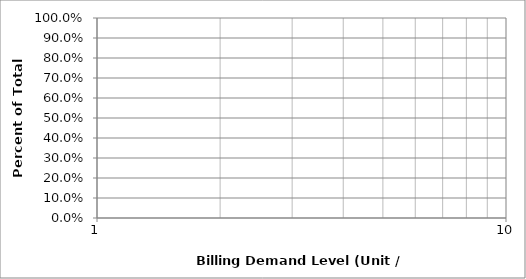
| Category | Series 7 |
|---|---|
| 0 | 0.062 |
| 1 | 0.123 |
| 2 | 0.182 |
| 3 | 0.239 |
| 4 | 0.294 |
| 5 | 0.345 |
| 6 | 0.394 |
| 7 | 0.439 |
| 8 | 0.481 |
| 9 | 0.519 |
| 10 | 0.554 |
| 11 | 0.585 |
| 12 | 0.614 |
| 13 | 0.64 |
| 14 | 0.663 |
| 15 | 0.684 |
| 16 | 0.703 |
| 17 | 0.72 |
| 18 | 0.736 |
| 19 | 0.75 |
| 20 | 0.763 |
| 21 | 0.774 |
| 22 | 0.785 |
| 23 | 0.794 |
| 24 | 0.803 |
| 25 | 0.811 |
| 26 | 0.819 |
| 27 | 0.825 |
| 28 | 0.832 |
| 29 | 0.838 |
| 30 | 0.843 |
| 31 | 0.848 |
| 32 | 0.853 |
| 33 | 0.858 |
| 34 | 0.862 |
| 35 | 0.866 |
| 36 | 0.87 |
| 37 | 0.873 |
| 38 | 0.877 |
| 39 | 0.88 |
| 40 | 0.883 |
| 41 | 0.886 |
| 42 | 0.889 |
| 43 | 0.891 |
| 44 | 0.894 |
| 45 | 0.896 |
| 46 | 0.899 |
| 47 | 0.901 |
| 48 | 0.903 |
| 49 | 0.905 |
| 50 | 0.907 |
| 51 | 0.909 |
| 52 | 0.911 |
| 53 | 0.913 |
| 54 | 0.914 |
| 55 | 0.916 |
| 56 | 0.918 |
| 57 | 0.919 |
| 58 | 0.921 |
| 59 | 0.922 |
| 60 | 0.923 |
| 61 | 0.925 |
| 62 | 0.926 |
| 63 | 0.927 |
| 64 | 0.928 |
| 65 | 0.93 |
| 66 | 0.931 |
| 67 | 0.932 |
| 68 | 0.933 |
| 69 | 0.934 |
| 70 | 0.935 |
| 71 | 0.936 |
| 72 | 0.937 |
| 73 | 0.938 |
| 74 | 0.939 |
| 75 | 0.94 |
| 76 | 0.94 |
| 77 | 0.941 |
| 78 | 0.942 |
| 79 | 0.943 |
| 80 | 0.944 |
| 81 | 0.944 |
| 82 | 0.945 |
| 83 | 0.946 |
| 84 | 0.946 |
| 85 | 0.947 |
| 86 | 0.948 |
| 87 | 0.948 |
| 88 | 0.949 |
| 89 | 0.95 |
| 90 | 0.95 |
| 91 | 0.951 |
| 92 | 0.951 |
| 93 | 0.952 |
| 94 | 0.952 |
| 95 | 0.953 |
| 96 | 0.953 |
| 97 | 0.954 |
| 98 | 0.954 |
| 99 | 0.955 |
| 100 | 0.955 |
| 101 | 0.956 |
| 102 | 0.956 |
| 103 | 0.957 |
| 104 | 0.957 |
| 105 | 0.957 |
| 106 | 0.958 |
| 107 | 0.958 |
| 108 | 0.959 |
| 109 | 0.959 |
| 110 | 0.959 |
| 111 | 0.96 |
| 112 | 0.96 |
| 113 | 0.96 |
| 114 | 0.961 |
| 115 | 0.961 |
| 116 | 0.961 |
| 117 | 0.962 |
| 118 | 0.962 |
| 119 | 0.962 |
| 120 | 0.963 |
| 121 | 0.963 |
| 122 | 0.963 |
| 123 | 0.964 |
| 124 | 0.964 |
| 125 | 0.964 |
| 126 | 0.964 |
| 127 | 0.965 |
| 128 | 0.965 |
| 129 | 0.965 |
| 130 | 0.965 |
| 131 | 0.966 |
| 132 | 0.966 |
| 133 | 0.966 |
| 134 | 0.966 |
| 135 | 0.966 |
| 136 | 0.967 |
| 137 | 0.967 |
| 138 | 0.967 |
| 139 | 0.967 |
| 140 | 0.967 |
| 141 | 0.968 |
| 142 | 0.968 |
| 143 | 0.968 |
| 144 | 0.968 |
| 145 | 0.968 |
| 146 | 0.969 |
| 147 | 0.969 |
| 148 | 0.969 |
| 149 | 0.969 |
| 150 | 0.969 |
| 151 | 0.969 |
| 152 | 0.97 |
| 153 | 0.97 |
| 154 | 0.97 |
| 155 | 0.97 |
| 156 | 0.97 |
| 157 | 0.97 |
| 158 | 0.971 |
| 159 | 0.971 |
| 160 | 0.971 |
| 161 | 0.971 |
| 162 | 0.971 |
| 163 | 0.971 |
| 164 | 0.971 |
| 165 | 0.971 |
| 166 | 0.972 |
| 167 | 0.972 |
| 168 | 0.972 |
| 169 | 0.972 |
| 170 | 0.972 |
| 171 | 0.972 |
| 172 | 0.972 |
| 173 | 0.972 |
| 174 | 0.973 |
| 175 | 0.973 |
| 176 | 0.973 |
| 177 | 0.973 |
| 178 | 0.973 |
| 179 | 0.973 |
| 180 | 0.973 |
| 181 | 0.973 |
| 182 | 0.973 |
| 183 | 0.973 |
| 184 | 0.974 |
| 185 | 0.974 |
| 186 | 0.974 |
| 187 | 0.974 |
| 188 | 0.974 |
| 189 | 0.974 |
| 190 | 0.974 |
| 191 | 0.974 |
| 192 | 0.974 |
| 193 | 0.974 |
| 194 | 0.974 |
| 195 | 0.975 |
| 196 | 0.975 |
| 197 | 0.975 |
| 198 | 0.975 |
| 199 | 0.975 |
| 200 | 0.975 |
| 201 | 0.975 |
| 202 | 0.975 |
| 203 | 0.975 |
| 204 | 0.975 |
| 205 | 0.975 |
| 206 | 0.975 |
| 207 | 0.976 |
| 208 | 0.976 |
| 209 | 0.976 |
| 210 | 0.976 |
| 211 | 0.976 |
| 212 | 0.976 |
| 213 | 0.976 |
| 214 | 0.976 |
| 215 | 0.976 |
| 216 | 0.976 |
| 217 | 0.976 |
| 218 | 0.976 |
| 219 | 0.976 |
| 220 | 0.976 |
| 221 | 0.976 |
| 222 | 0.977 |
| 223 | 0.977 |
| 224 | 0.977 |
| 225 | 0.977 |
| 226 | 0.977 |
| 227 | 0.977 |
| 228 | 0.977 |
| 229 | 0.977 |
| 230 | 0.977 |
| 231 | 0.977 |
| 232 | 0.977 |
| 233 | 0.977 |
| 234 | 0.977 |
| 235 | 0.977 |
| 236 | 0.977 |
| 237 | 0.977 |
| 238 | 0.977 |
| 239 | 0.978 |
| 240 | 0.978 |
| 241 | 0.978 |
| 242 | 0.978 |
| 243 | 0.978 |
| 244 | 0.978 |
| 245 | 0.978 |
| 246 | 0.978 |
| 247 | 0.978 |
| 248 | 0.978 |
| 249 | 0.978 |
| 250 | 0.978 |
| 251 | 0.978 |
| 252 | 0.978 |
| 253 | 0.978 |
| 254 | 0.978 |
| 255 | 0.978 |
| 256 | 0.978 |
| 257 | 0.978 |
| 258 | 0.978 |
| 259 | 0.979 |
| 260 | 0.979 |
| 261 | 0.979 |
| 262 | 0.979 |
| 263 | 0.979 |
| 264 | 0.979 |
| 265 | 0.979 |
| 266 | 0.979 |
| 267 | 0.979 |
| 268 | 0.979 |
| 269 | 0.979 |
| 270 | 0.979 |
| 271 | 0.979 |
| 272 | 0.979 |
| 273 | 0.979 |
| 274 | 0.979 |
| 275 | 0.979 |
| 276 | 0.979 |
| 277 | 0.979 |
| 278 | 0.979 |
| 279 | 0.979 |
| 280 | 0.979 |
| 281 | 0.979 |
| 282 | 0.979 |
| 283 | 0.98 |
| 284 | 0.98 |
| 285 | 0.98 |
| 286 | 0.98 |
| 287 | 0.98 |
| 288 | 0.98 |
| 289 | 0.98 |
| 290 | 0.98 |
| 291 | 0.98 |
| 292 | 0.98 |
| 293 | 0.98 |
| 294 | 0.98 |
| 295 | 0.98 |
| 296 | 0.98 |
| 297 | 0.98 |
| 298 | 0.98 |
| 299 | 0.98 |
| 300 | 0.98 |
| 301 | 0.98 |
| 302 | 0.98 |
| 303 | 0.98 |
| 304 | 0.98 |
| 305 | 0.98 |
| 306 | 0.98 |
| 307 | 0.98 |
| 308 | 0.98 |
| 309 | 0.98 |
| 310 | 0.98 |
| 311 | 0.98 |
| 312 | 0.981 |
| 313 | 0.981 |
| 314 | 0.981 |
| 315 | 0.981 |
| 316 | 0.981 |
| 317 | 0.981 |
| 318 | 0.981 |
| 319 | 0.981 |
| 320 | 0.981 |
| 321 | 0.981 |
| 322 | 0.981 |
| 323 | 0.981 |
| 324 | 0.981 |
| 325 | 0.981 |
| 326 | 0.981 |
| 327 | 0.981 |
| 328 | 0.981 |
| 329 | 0.981 |
| 330 | 0.981 |
| 331 | 0.981 |
| 332 | 0.981 |
| 333 | 0.981 |
| 334 | 0.981 |
| 335 | 0.981 |
| 336 | 0.981 |
| 337 | 0.981 |
| 338 | 0.981 |
| 339 | 0.981 |
| 340 | 0.981 |
| 341 | 0.981 |
| 342 | 0.981 |
| 343 | 0.981 |
| 344 | 0.981 |
| 345 | 0.982 |
| 346 | 0.982 |
| 347 | 0.982 |
| 348 | 0.982 |
| 349 | 0.982 |
| 350 | 0.982 |
| 351 | 0.982 |
| 352 | 0.982 |
| 353 | 0.982 |
| 354 | 0.982 |
| 355 | 0.982 |
| 356 | 0.982 |
| 357 | 0.982 |
| 358 | 0.982 |
| 359 | 0.982 |
| 360 | 0.982 |
| 361 | 0.982 |
| 362 | 0.982 |
| 363 | 0.982 |
| 364 | 0.982 |
| 365 | 0.982 |
| 366 | 0.982 |
| 367 | 0.982 |
| 368 | 0.982 |
| 369 | 0.982 |
| 370 | 0.982 |
| 371 | 0.982 |
| 372 | 0.982 |
| 373 | 0.982 |
| 374 | 0.982 |
| 375 | 0.983 |
| 376 | 0.983 |
| 377 | 0.983 |
| 378 | 0.983 |
| 379 | 0.983 |
| 380 | 0.983 |
| 381 | 0.983 |
| 382 | 0.983 |
| 383 | 0.983 |
| 384 | 0.983 |
| 385 | 0.983 |
| 386 | 0.983 |
| 387 | 0.983 |
| 388 | 0.983 |
| 389 | 0.983 |
| 390 | 0.983 |
| 391 | 0.983 |
| 392 | 0.983 |
| 393 | 0.983 |
| 394 | 0.983 |
| 395 | 0.983 |
| 396 | 0.983 |
| 397 | 0.983 |
| 398 | 0.983 |
| 399 | 0.983 |
| 400 | 0.983 |
| 401 | 0.983 |
| 402 | 0.983 |
| 403 | 0.983 |
| 404 | 0.983 |
| 405 | 0.983 |
| 406 | 0.983 |
| 407 | 0.983 |
| 408 | 0.983 |
| 409 | 0.983 |
| 410 | 0.983 |
| 411 | 0.983 |
| 412 | 0.983 |
| 413 | 0.983 |
| 414 | 0.983 |
| 415 | 0.984 |
| 416 | 0.984 |
| 417 | 0.984 |
| 418 | 0.984 |
| 419 | 0.984 |
| 420 | 0.984 |
| 421 | 0.984 |
| 422 | 0.984 |
| 423 | 0.984 |
| 424 | 0.984 |
| 425 | 0.984 |
| 426 | 0.984 |
| 427 | 0.984 |
| 428 | 0.984 |
| 429 | 0.984 |
| 430 | 0.984 |
| 431 | 0.984 |
| 432 | 0.984 |
| 433 | 0.984 |
| 434 | 0.984 |
| 435 | 0.984 |
| 436 | 0.984 |
| 437 | 0.984 |
| 438 | 0.984 |
| 439 | 0.984 |
| 440 | 0.985 |
| 441 | 0.985 |
| 442 | 0.985 |
| 443 | 0.985 |
| 444 | 0.985 |
| 445 | 0.985 |
| 446 | 0.985 |
| 447 | 0.985 |
| 448 | 0.985 |
| 449 | 0.985 |
| 450 | 0.985 |
| 451 | 0.985 |
| 452 | 0.985 |
| 453 | 0.985 |
| 454 | 0.985 |
| 455 | 0.985 |
| 456 | 0.985 |
| 457 | 0.986 |
| 458 | 0.986 |
| 459 | 0.986 |
| 460 | 0.986 |
| 461 | 0.986 |
| 462 | 0.986 |
| 463 | 0.986 |
| 464 | 0.986 |
| 465 | 0.986 |
| 466 | 0.986 |
| 467 | 0.986 |
| 468 | 0.986 |
| 469 | 0.986 |
| 470 | 0.986 |
| 471 | 0.986 |
| 472 | 0.986 |
| 473 | 0.986 |
| 474 | 0.986 |
| 475 | 0.986 |
| 476 | 0.986 |
| 477 | 0.986 |
| 478 | 0.986 |
| 479 | 0.986 |
| 480 | 0.986 |
| 481 | 0.986 |
| 482 | 0.986 |
| 483 | 0.986 |
| 484 | 0.986 |
| 485 | 0.987 |
| 486 | 0.987 |
| 487 | 0.987 |
| 488 | 0.987 |
| 489 | 0.987 |
| 490 | 0.987 |
| 491 | 0.987 |
| 492 | 0.987 |
| 493 | 0.987 |
| 494 | 0.987 |
| 495 | 0.987 |
| 496 | 0.987 |
| 497 | 0.987 |
| 498 | 0.987 |
| 499 | 0.987 |
| 500 | 0.987 |
| 501 | 0.988 |
| 502 | 0.988 |
| 503 | 0.988 |
| 504 | 0.988 |
| 505 | 0.988 |
| 506 | 0.988 |
| 507 | 0.988 |
| 508 | 0.988 |
| 509 | 0.988 |
| 510 | 0.988 |
| 511 | 0.988 |
| 512 | 0.988 |
| 513 | 0.988 |
| 514 | 0.988 |
| 515 | 0.989 |
| 516 | 0.989 |
| 517 | 0.989 |
| 518 | 0.989 |
| 519 | 0.989 |
| 520 | 0.989 |
| 521 | 0.989 |
| 522 | 0.989 |
| 523 | 0.989 |
| 524 | 0.989 |
| 525 | 0.99 |
| 526 | 0.99 |
| 527 | 0.99 |
| 528 | 0.99 |
| 529 | 0.99 |
| 530 | 0.99 |
| 531 | 0.991 |
| 532 | 0.991 |
| 533 | 0.991 |
| 534 | 0.991 |
| 535 | 0.991 |
| 536 | 0.991 |
| 537 | 0.991 |
| 538 | 0.991 |
| 539 | 0.992 |
| 540 | 0.992 |
| 541 | 0.992 |
| 542 | 0.992 |
| 543 | 0.993 |
| 544 | 0.994 |
| 545 | 0.998 |
| 546 | 0.998 |
| 547 | 0.999 |
| 548 | 0.999 |
| 549 | 1 |
| 550 | 1 |
| 551 | 1 |
| 552 | 1 |
| 553 | 1 |
| 554 | 1 |
| 555 | 1 |
| 556 | 1 |
| 557 | 1 |
| 558 | 1 |
| 559 | 1 |
| 560 | 1 |
| 561 | 1 |
| 562 | 1 |
| 563 | 1 |
| 564 | 1 |
| 565 | 1 |
| 566 | 1 |
| 567 | 1 |
| 568 | 1 |
| 569 | 1 |
| 570 | 1 |
| 571 | 1 |
| 572 | 1 |
| 573 | 1 |
| 574 | 1 |
| 575 | 1 |
| 576 | 1 |
| 577 | 1 |
| 578 | 1 |
| 579 | 1 |
| 580 | 1 |
| 581 | 1 |
| 582 | 1 |
| 583 | 1 |
| 584 | 1 |
| 585 | 1 |
| 586 | 1 |
| 587 | 1 |
| 588 | 1 |
| 589 | 1 |
| 590 | 1 |
| 591 | 1 |
| 592 | 1 |
| 593 | 1 |
| 594 | 1 |
| 595 | 1 |
| 596 | 1 |
| 597 | 1 |
| 598 | 1 |
| 599 | 1 |
| 600 | 1 |
| 601 | 1 |
| 602 | 1 |
| 603 | 1 |
| 604 | 1 |
| 605 | 1 |
| 606 | 1 |
| 607 | 1 |
| 608 | 1 |
| 609 | 1 |
| 610 | 1 |
| 611 | 1 |
| 612 | 1 |
| 613 | 1 |
| 614 | 1 |
| 615 | 1 |
| 616 | 1 |
| 617 | 1 |
| 618 | 1 |
| 619 | 1 |
| 620 | 1 |
| 621 | 1 |
| 622 | 1 |
| 623 | 1 |
| 624 | 1 |
| 625 | 1 |
| 626 | 1 |
| 627 | 1 |
| 628 | 1 |
| 629 | 1 |
| 630 | 1 |
| 631 | 1 |
| 632 | 1 |
| 633 | 1 |
| 634 | 1 |
| 635 | 1 |
| 636 | 1 |
| 637 | 1 |
| 638 | 1 |
| 639 | 1 |
| 640 | 1 |
| 641 | 1 |
| 642 | 1 |
| 643 | 1 |
| 644 | 1 |
| 645 | 1 |
| 646 | 1 |
| 647 | 1 |
| 648 | 1 |
| 649 | 1 |
| 650 | 1 |
| 651 | 1 |
| 652 | 1 |
| 653 | 1 |
| 654 | 1 |
| 655 | 1 |
| 656 | 1 |
| 657 | 1 |
| 658 | 1 |
| 659 | 1 |
| 660 | 1 |
| 661 | 1 |
| 662 | 1 |
| 663 | 1 |
| 664 | 1 |
| 665 | 1 |
| 666 | 1 |
| 667 | 1 |
| 668 | 1 |
| 669 | 1 |
| 670 | 1 |
| 671 | 1 |
| 672 | 1 |
| 673 | 1 |
| 674 | 1 |
| 675 | 1 |
| 676 | 1 |
| 677 | 1 |
| 678 | 1 |
| 679 | 1 |
| 680 | 1 |
| 681 | 1 |
| 682 | 1 |
| 683 | 1 |
| 684 | 1 |
| 685 | 1 |
| 686 | 1 |
| 687 | 1 |
| 688 | 1 |
| 689 | 1 |
| 690 | 1 |
| 691 | 1 |
| 692 | 1 |
| 693 | 1 |
| 694 | 1 |
| 695 | 1 |
| 696 | 1 |
| 697 | 1 |
| 698 | 1 |
| 699 | 1 |
| 700 | 1 |
| 701 | 1 |
| 702 | 1 |
| 703 | 1 |
| 704 | 1 |
| 705 | 1 |
| 706 | 1 |
| 707 | 1 |
| 708 | 1 |
| 709 | 1 |
| 710 | 1 |
| 711 | 1 |
| 712 | 1 |
| 713 | 1 |
| 714 | 1 |
| 715 | 1 |
| 716 | 1 |
| 717 | 1 |
| 718 | 1 |
| 719 | 1 |
| 720 | 1 |
| 721 | 1 |
| 722 | 1 |
| 723 | 1 |
| 724 | 1 |
| 725 | 1 |
| 726 | 1 |
| 727 | 1 |
| 728 | 1 |
| 729 | 1 |
| 730 | 1 |
| 731 | 1 |
| 732 | 1 |
| 733 | 1 |
| 734 | 1 |
| 735 | 1 |
| 736 | 1 |
| 737 | 1 |
| 738 | 1 |
| 739 | 1 |
| 740 | 1 |
| 741 | 1 |
| 742 | 1 |
| 743 | 1 |
| 744 | 1 |
| 745 | 1 |
| 746 | 1 |
| 747 | 1 |
| 748 | 1 |
| 749 | 1 |
| 750 | 1 |
| 751 | 1 |
| 752 | 1 |
| 753 | 1 |
| 754 | 1 |
| 755 | 1 |
| 756 | 1 |
| 757 | 1 |
| 758 | 1 |
| 759 | 1 |
| 760 | 1 |
| 761 | 1 |
| 762 | 1 |
| 763 | 1 |
| 764 | 1 |
| 765 | 1 |
| 766 | 1 |
| 767 | 1 |
| 768 | 1 |
| 769 | 1 |
| 770 | 1 |
| 771 | 1 |
| 772 | 1 |
| 773 | 1 |
| 774 | 1 |
| 775 | 1 |
| 776 | 1 |
| 777 | 1 |
| 778 | 1 |
| 779 | 1 |
| 780 | 1 |
| 781 | 1 |
| 782 | 1 |
| 783 | 1 |
| 784 | 1 |
| 785 | 1 |
| 786 | 1 |
| 787 | 1 |
| 788 | 1 |
| 789 | 1 |
| 790 | 1 |
| 791 | 1 |
| 792 | 1 |
| 793 | 1 |
| 794 | 1 |
| 795 | 1 |
| 796 | 1 |
| 797 | 1 |
| 798 | 1 |
| 799 | 1 |
| 800 | 1 |
| 801 | 1 |
| 802 | 1 |
| 803 | 1 |
| 804 | 1 |
| 805 | 1 |
| 806 | 1 |
| 807 | 1 |
| 808 | 1 |
| 809 | 1 |
| 810 | 1 |
| 811 | 1 |
| 812 | 1 |
| 813 | 1 |
| 814 | 1 |
| 815 | 1 |
| 816 | 1 |
| 817 | 1 |
| 818 | 1 |
| 819 | 1 |
| 820 | 1 |
| 821 | 1 |
| 822 | 1 |
| 823 | 1 |
| 824 | 1 |
| 825 | 1 |
| 826 | 1 |
| 827 | 1 |
| 828 | 1 |
| 829 | 1 |
| 830 | 1 |
| 831 | 1 |
| 832 | 1 |
| 833 | 1 |
| 834 | 1 |
| 835 | 1 |
| 836 | 1 |
| 837 | 1 |
| 838 | 1 |
| 839 | 1 |
| 840 | 1 |
| 841 | 1 |
| 842 | 1 |
| 843 | 1 |
| 844 | 1 |
| 845 | 1 |
| 846 | 1 |
| 847 | 1 |
| 848 | 1 |
| 849 | 1 |
| 850 | 1 |
| 851 | 1 |
| 852 | 1 |
| 853 | 1 |
| 854 | 1 |
| 855 | 1 |
| 856 | 1 |
| 857 | 1 |
| 858 | 1 |
| 859 | 1 |
| 860 | 1 |
| 861 | 1 |
| 862 | 1 |
| 863 | 1 |
| 864 | 1 |
| 865 | 1 |
| 866 | 1 |
| 867 | 1 |
| 868 | 1 |
| 869 | 1 |
| 870 | 1 |
| 871 | 1 |
| 872 | 1 |
| 873 | 1 |
| 874 | 1 |
| 875 | 1 |
| 876 | 1 |
| 877 | 1 |
| 878 | 1 |
| 879 | 1 |
| 880 | 1 |
| 881 | 1 |
| 882 | 1 |
| 883 | 1 |
| 884 | 1 |
| 885 | 1 |
| 886 | 1 |
| 887 | 1 |
| 888 | 1 |
| 889 | 1 |
| 890 | 1 |
| 891 | 1 |
| 892 | 1 |
| 893 | 1 |
| 894 | 1 |
| 895 | 1 |
| 896 | 1 |
| 897 | 1 |
| 898 | 1 |
| 899 | 1 |
| 900 | 1 |
| 901 | 1 |
| 902 | 1 |
| 903 | 1 |
| 904 | 1 |
| 905 | 1 |
| 906 | 1 |
| 907 | 1 |
| 908 | 1 |
| 909 | 1 |
| 910 | 1 |
| 911 | 1 |
| 912 | 1 |
| 913 | 1 |
| 914 | 1 |
| 915 | 1 |
| 916 | 1 |
| 917 | 1 |
| 918 | 1 |
| 919 | 1 |
| 920 | 1 |
| 921 | 1 |
| 922 | 1 |
| 923 | 1 |
| 924 | 1 |
| 925 | 1 |
| 926 | 1 |
| 927 | 1 |
| 928 | 1 |
| 929 | 1 |
| 930 | 1 |
| 931 | 1 |
| 932 | 1 |
| 933 | 1 |
| 934 | 1 |
| 935 | 1 |
| 936 | 1 |
| 937 | 1 |
| 938 | 1 |
| 939 | 1 |
| 940 | 1 |
| 941 | 1 |
| 942 | 1 |
| 943 | 1 |
| 944 | 1 |
| 945 | 1 |
| 946 | 1 |
| 947 | 1 |
| 948 | 1 |
| 949 | 1 |
| 950 | 1 |
| 951 | 1 |
| 952 | 1 |
| 953 | 1 |
| 954 | 1 |
| 955 | 1 |
| 956 | 1 |
| 957 | 1 |
| 958 | 1 |
| 959 | 1 |
| 960 | 1 |
| 961 | 1 |
| 962 | 1 |
| 963 | 1 |
| 964 | 1 |
| 965 | 1 |
| 966 | 1 |
| 967 | 1 |
| 968 | 1 |
| 969 | 1 |
| 970 | 1 |
| 971 | 1 |
| 972 | 1 |
| 973 | 1 |
| 974 | 1 |
| 975 | 1 |
| 976 | 1 |
| 977 | 1 |
| 978 | 1 |
| 979 | 1 |
| 980 | 1 |
| 981 | 1 |
| 982 | 1 |
| 983 | 1 |
| 984 | 1 |
| 985 | 1 |
| 986 | 1 |
| 987 | 1 |
| 988 | 1 |
| 989 | 1 |
| 990 | 1 |
| 991 | 1 |
| 992 | 1 |
| 993 | 1 |
| 994 | 1 |
| 995 | 1 |
| 996 | 1 |
| 997 | 1 |
| 998 | 1 |